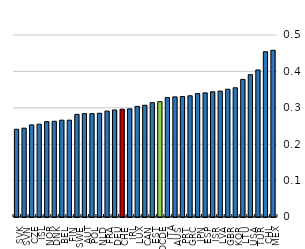
| Category | Gini |
|---|---|
| SVK | 0.241 |
| SVN | 0.244 |
| CZE | 0.253 |
| ISL | 0.255 |
| NOR | 0.262 |
| DNK | 0.263 |
| BEL | 0.266 |
| FIN | 0.266 |
| SWE | 0.282 |
| AUT | 0.284 |
| POL | 0.284 |
| NLD | 0.285 |
| FRA | 0.291 |
| DEU | 0.294 |
| CHE | 0.296 |
| IRL | 0.297 |
| LUX | 0.304 |
| CAN | 0.307 |
| EST | 0.314 |
| OCDE | 0.317 |
| ITA | 0.328 |
| AUS | 0.33 |
| PRT | 0.331 |
| GRC | 0.333 |
| JPN | 0.339 |
| ESP | 0.341 |
| ISR | 0.344 |
| LVA | 0.346 |
| GBR | 0.351 |
| KOR | 0.355 |
| LTU | 0.378 |
| USA | 0.391 |
| TUR | 0.404 |
| CHL | 0.454 |
| MEX | 0.458 |